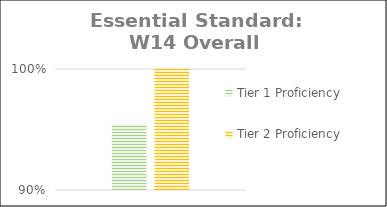
| Category | Tier 1 Proficiency | Tier 2 Proficiency |
|---|---|---|
| 0 | 0.954 | 1 |